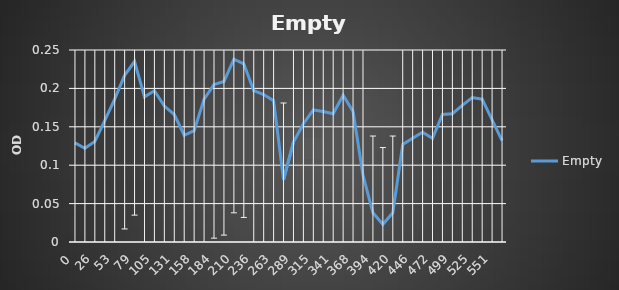
| Category | Empty |
|---|---|
| 0.0 | 0.129 |
| 13.0 | 0.122 |
| 26.0 | 0.131 |
| 39.0 | 0.158 |
| 53.0 | 0.186 |
| 66.0 | 0.217 |
| 79.0 | 0.235 |
| 92.0 | 0.189 |
| 105.0 | 0.197 |
| 118.0 | 0.177 |
| 131.0 | 0.166 |
| 144.0 | 0.139 |
| 158.0 | 0.145 |
| 171.0 | 0.186 |
| 184.0 | 0.205 |
| 197.0 | 0.209 |
| 210.0 | 0.238 |
| 223.0 | 0.232 |
| 236.0 | 0.197 |
| 249.0 | 0.192 |
| 263.0 | 0.184 |
| 276.0 | 0.081 |
| 289.0 | 0.13 |
| 302.0 | 0.154 |
| 315.0 | 0.172 |
| 328.0 | 0.17 |
| 341.0 | 0.167 |
| 354.0 | 0.191 |
| 368.0 | 0.17 |
| 381.0 | 0.087 |
| 394.0 | 0.038 |
| 407.0 | 0.023 |
| 420.0 | 0.038 |
| 433.0 | 0.127 |
| 446.0 | 0.135 |
| 459.0 | 0.143 |
| 472.0 | 0.135 |
| 486.0 | 0.166 |
| 499.0 | 0.167 |
| 512.0 | 0.178 |
| 525.0 | 0.188 |
| 538.0 | 0.186 |
| 551.0 | 0.159 |
| 564.0 | 0.132 |